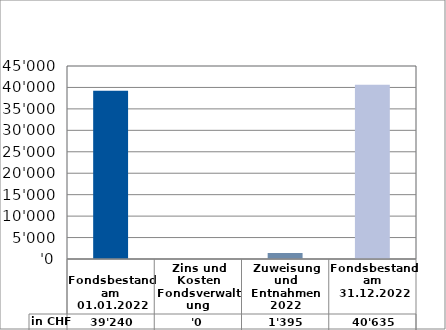
| Category | in CHF |
|---|---|
| 
Fondsbestand am 01.01.2022

 | 39240 |
| Zins und Kosten Fondsverwaltung | 0 |
| Zuweisung und Entnahmen 2022 | 1395.25 |
| Fondsbestand am 31.12.2022 | 40635.25 |